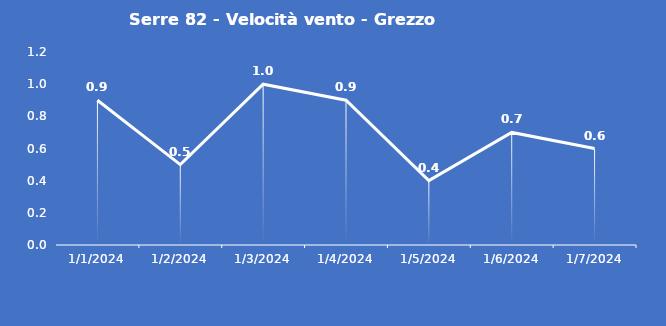
| Category | Serre 82 - Velocità vento - Grezzo (m/s) |
|---|---|
| 1/1/24 | 0.9 |
| 1/2/24 | 0.5 |
| 1/3/24 | 1 |
| 1/4/24 | 0.9 |
| 1/5/24 | 0.4 |
| 1/6/24 | 0.7 |
| 1/7/24 | 0.6 |